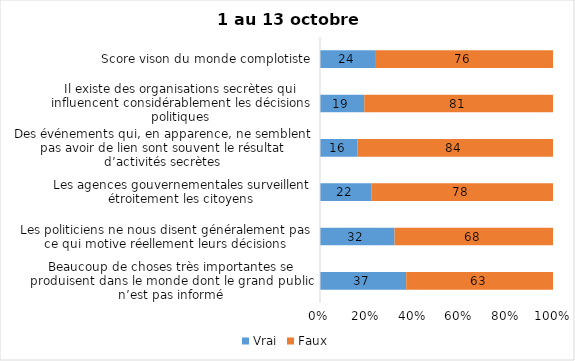
| Category | Vrai | Faux |
|---|---|---|
| Beaucoup de choses très importantes se produisent dans le monde dont le grand public n’est pas informé | 37 | 63 |
| Les politiciens ne nous disent généralement pas ce qui motive réellement leurs décisions | 32 | 68 |
| Les agences gouvernementales surveillent étroitement les citoyens | 22 | 78 |
| Des événements qui, en apparence, ne semblent pas avoir de lien sont souvent le résultat d’activités secrètes | 16 | 84 |
| Il existe des organisations secrètes qui influencent considérablement les décisions politiques | 19 | 81 |
| Score vison du monde complotiste | 24 | 76 |